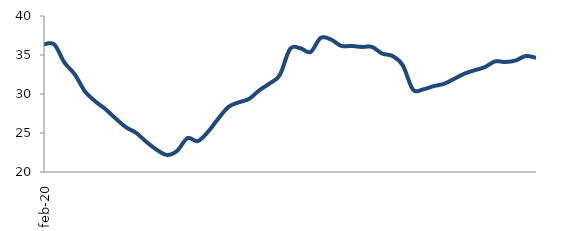
| Category | Series 0 |
|---|---|
| 2020-02-01 | 36.369 |
| 2020-03-01 | 36.361 |
| 2020-04-01 | 34.017 |
| 2020-05-01 | 32.52 |
| 2020-06-01 | 30.328 |
| 2020-07-01 | 29.058 |
| 2020-08-01 | 28.052 |
| 2020-09-01 | 26.848 |
| 2020-10-01 | 25.737 |
| 2020-11-01 | 25.008 |
| 2020-12-01 | 23.848 |
| 2021-01-01 | 22.846 |
| 2021-02-01 | 22.188 |
| 2021-03-01 | 22.726 |
| 2021-04-01 | 24.345 |
| 2021-05-01 | 23.958 |
| 2021-06-01 | 25.156 |
| 2021-07-01 | 26.838 |
| 2021-08-01 | 28.346 |
| 2021-09-01 | 28.934 |
| 2021-10-01 | 29.363 |
| 2021-11-01 | 30.47 |
| 2021-12-01 | 31.341 |
| 2022-01-01 | 32.424 |
| 2022-02-01 | 35.771 |
| 2022-03-01 | 35.868 |
| 2022-04-01 | 35.381 |
| 2022-05-01 | 37.2 |
| 2022-06-01 | 36.986 |
| 2022-07-01 | 36.172 |
| 2022-08-01 | 36.157 |
| 2022-09-01 | 36.033 |
| 2022-10-01 | 36.034 |
| 2022-11-01 | 35.183 |
| 2022-12-01 | 34.87 |
| 2023-01-01 | 33.684 |
| 2023-02-01 | 30.55 |
| 2023-03-01 | 30.596 |
| 2023-04-01 | 31.004 |
| 2023-05-01 | 31.3 |
| 2023-06-01 | 31.93 |
| 2023-07-01 | 32.601 |
| 2023-08-01 | 33.043 |
| 2023-09-01 | 33.443 |
| 2023-10-01 | 34.176 |
| 2023-11-01 | 34.098 |
| 2023-12-01 | 34.291 |
| 2024-01-01 | 34.874 |
| 2024-02-01 | 34.641 |